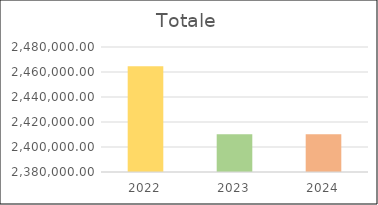
| Category | Series 0 |
|---|---|
| 2022.0 | 2464554 |
| 2023.0 | 2410296 |
| 2024.0 | 2410296 |